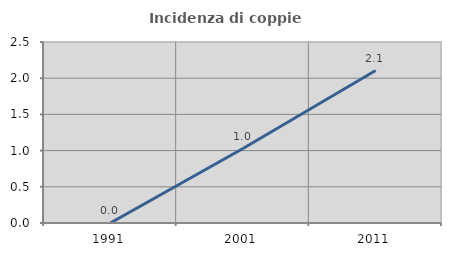
| Category | Incidenza di coppie miste |
|---|---|
| 1991.0 | 0 |
| 2001.0 | 1.028 |
| 2011.0 | 2.105 |